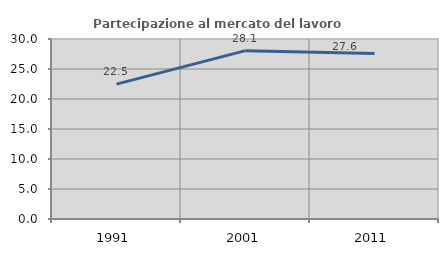
| Category | Partecipazione al mercato del lavoro  femminile |
|---|---|
| 1991.0 | 22.475 |
| 2001.0 | 28.056 |
| 2011.0 | 27.564 |